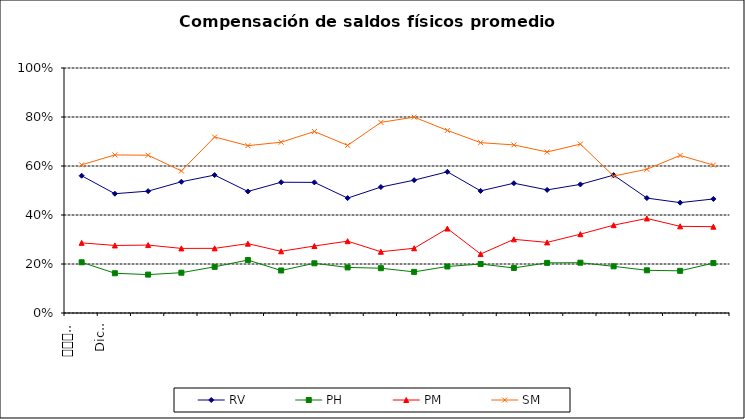
| Category | RV | PH | PM | SM |
|---|---|---|---|---|
| 0 | 0.56 | 0.207 | 0.286 | 0.605 |
| 1 | 0.487 | 0.162 | 0.276 | 0.645 |
| 2 | 0.497 | 0.157 | 0.277 | 0.644 |
| 3 | 0.536 | 0.164 | 0.264 | 0.58 |
| 4 | 0.563 | 0.188 | 0.264 | 0.718 |
| 5 | 0.496 | 0.216 | 0.283 | 0.683 |
| 6 | 0.534 | 0.174 | 0.252 | 0.697 |
| 7 | 0.533 | 0.203 | 0.273 | 0.741 |
| 8 | 0.469 | 0.186 | 0.293 | 0.684 |
| 9 | 0.514 | 0.183 | 0.25 | 0.778 |
| 10 | 0.542 | 0.168 | 0.264 | 0.8 |
| 11 | 0.576 | 0.19 | 0.345 | 0.745 |
| 12 | 0.498 | 0.2 | 0.241 | 0.695 |
| 13 | 0.53 | 0.184 | 0.301 | 0.686 |
| 14 | 0.502 | 0.205 | 0.288 | 0.657 |
| 15 | 0.525 | 0.205 | 0.322 | 0.689 |
| 16 | 0.563 | 0.19 | 0.358 | 0.559 |
| 17 | 0.469 | 0.174 | 0.386 | 0.587 |
| 18 | 0.45 | 0.172 | 0.354 | 0.643 |
| 19 | 0.465 | 0.204 | 0.352 | 0.604 |